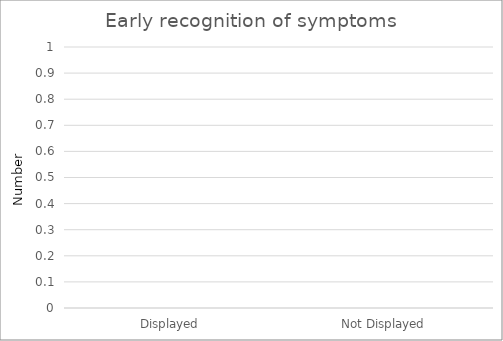
| Category | Early recognition of symptoms |
|---|---|
| Displayed | 0 |
| Not Displayed | 0 |